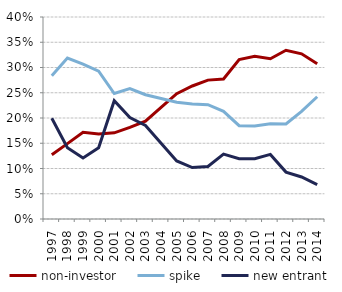
| Category | non-investor | spike | new entrant |
|---|---|---|---|
| 1997.0 | 0.127 | 0.284 | 0.2 |
| 1998.0 | 0.149 | 0.319 | 0.141 |
| 1999.0 | 0.172 | 0.307 | 0.121 |
| 2000.0 | 0.168 | 0.293 | 0.141 |
| 2001.0 | 0.171 | 0.249 | 0.234 |
| 2002.0 | 0.181 | 0.258 | 0.201 |
| 2003.0 | 0.194 | 0.246 | 0.185 |
| 2004.0 | 0.221 | 0.239 | 0.15 |
| 2005.0 | 0.248 | 0.231 | 0.115 |
| 2006.0 | 0.263 | 0.228 | 0.102 |
| 2007.0 | 0.275 | 0.226 | 0.104 |
| 2008.0 | 0.277 | 0.213 | 0.128 |
| 2009.0 | 0.316 | 0.185 | 0.119 |
| 2010.0 | 0.322 | 0.184 | 0.119 |
| 2011.0 | 0.317 | 0.188 | 0.128 |
| 2012.0 | 0.334 | 0.188 | 0.093 |
| 2013.0 | 0.327 | 0.213 | 0.083 |
| 2014.0 | 0.307 | 0.242 | 0.068 |